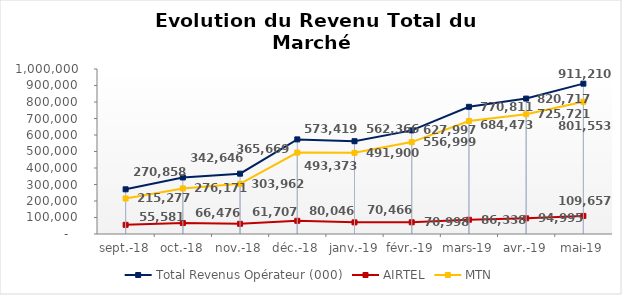
| Category | Total Revenus Opérateur (000) | AIRTEL | MTN |
|---|---|---|---|
| sept.-18 | 270858.496 | 55581.143 | 215277.353 |
| oct.-18 | 342646.413 | 66475.698 | 276170.715 |
| nov.-18 | 365668.685 | 61707.158 | 303961.527 |
| déc.-18 | 573419.12 | 80045.791 | 493373.329 |
| janv.-19 | 562366.213 | 70466.278 | 491899.935 |
| févr.-19 | 627996.845 | 70997.883 | 556998.962 |
| mars-19 | 770811.009 | 86338.276 | 684472.733 |
| avr.-19 | 820716.897 | 94995.423 | 725721.474 |
| mai-19 | 911210.203 | 109657.206 | 801552.997 |